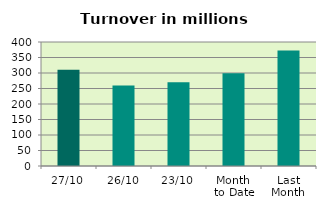
| Category | Series 0 |
|---|---|
| 27/10 | 310.391 |
| 26/10 | 259.775 |
| 23/10 | 269.897 |
| Month 
to Date | 299.325 |
| Last
Month | 372.713 |